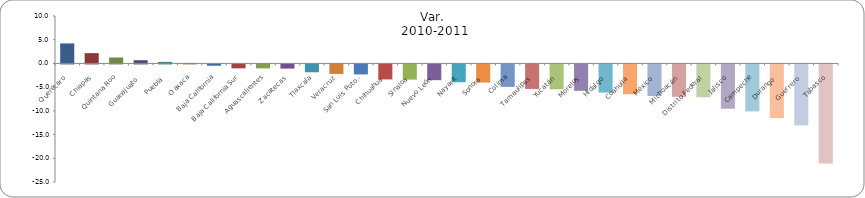
| Category | Var.
 2010-2011 |
|---|---|
| Querétaro | 4.218 |
| Chiapas | 2.17 |
| Quintana Roo | 1.249 |
| Guanajuato | 0.679 |
| Puebla | 0.32 |
| Oaxaca | 0.104 |
| Baja California | -0.275 |
| Baja California Sur | -0.824 |
| Aguascalientes | -0.827 |
| Zacatecas | -0.876 |
| Tlaxcala | -1.652 |
| Veracruz | -2.003 |
| San Luis Potosí | -2.11 |
| Chihuahua | -3.163 |
| Sinaloa | -3.198 |
| Nuevo León | -3.316 |
| Nayarit | -3.748 |
| Sonora | -3.827 |
| Colima | -4.732 |
| Tamaulipas | -5.167 |
| Yucatán | -5.236 |
| Morelos | -5.559 |
| Hidalgo | -5.938 |
| Coahuila | -6.284 |
| México | -6.66 |
| Michoacán | -6.831 |
| Distrito Federal | -6.902 |
| Jalisco | -9.337 |
| Campeche | -9.898 |
| Durango | -11.319 |
| Guerrero | -12.857 |
| Tabasco | -20.888 |